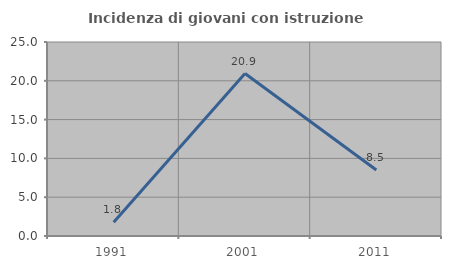
| Category | Incidenza di giovani con istruzione universitaria |
|---|---|
| 1991.0 | 1.786 |
| 2001.0 | 20.93 |
| 2011.0 | 8.511 |